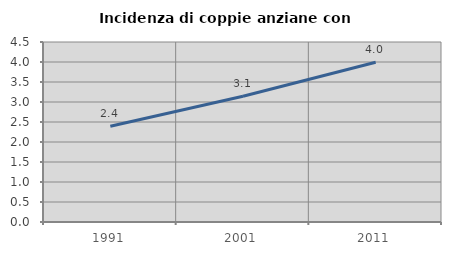
| Category | Incidenza di coppie anziane con figli |
|---|---|
| 1991.0 | 2.394 |
| 2001.0 | 3.143 |
| 2011.0 | 3.992 |